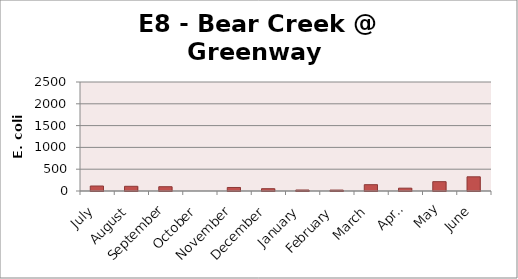
| Category | E. coli MPN |
|---|---|
| July | 114.5 |
| August | 107.6 |
| September | 98.5 |
| October | 0 |
| November | 80.9 |
| December | 52.9 |
| January | 22.6 |
| February | 20.9 |
| March | 145 |
| April | 65 |
| May | 214.3 |
| June | 325.5 |